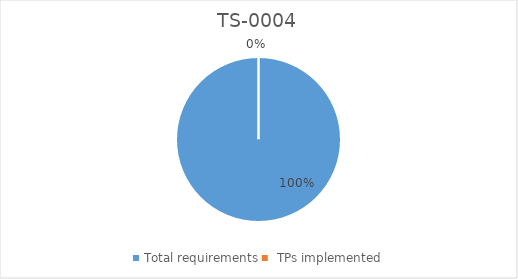
| Category | TS-0004 |
|---|---|
| Total requirements | 538 |
|  TPs implemented | 0 |